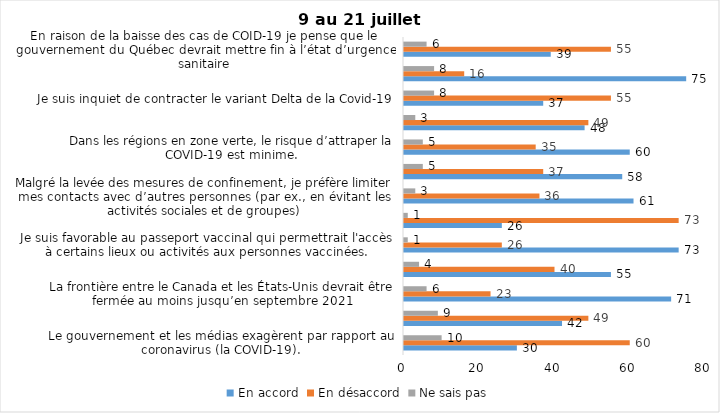
| Category | En accord | En désaccord | Ne sais pas |
|---|---|---|---|
| Le gouvernement et les médias exagèrent par rapport au coronavirus (la COVID-19). | 30 | 60 | 10 |
| J’ai peur que le système de santé soit débordé par les cas de COVID-19 suite au "déconfinement" | 42 | 49 | 9 |
| La frontière entre le Canada et les États-Unis devrait être fermée au moins jusqu’en septembre 2021 | 71 | 23 | 6 |
| Les personnes vaccinées contre la COVID-19 devraient avoir le droit de faire des rassemblements privés et de ne plus porter le masque dans les lieux publics. | 55 | 40 | 4 |
| Je suis favorable au passeport vaccinal qui permettrait l'accès à certains lieux ou activités aux personnes vaccinées. | 73 | 26 | 1 |
| Étant donné la progression de la vaccination et la diminution du nombre de cas de COVID-19, je pense qu’il est moins important de suivre les mesures de prévention. | 26 | 73 | 1 |
| Malgré la levée des mesures de confinement, je préfère limiter mes contacts avec d’autres personnes (par ex., en évitant les activités sociales et de groupes) | 61 | 36 | 3 |
| J’ai peur qu’il y ait une 4e vague de la COVID-19. | 58 | 37 | 5 |
| Dans les régions en zone verte, le risque d’attraper la COVID-19 est minime. | 60 | 35 | 5 |
| Si les cas de COVID-19 augmentent cet automne, je suis favorable à la mise en place de mesures de confinement (ex. fermeture de services non essentiels, interdiction des rassemblements privés) | 48 | 49 | 3 |
| Je suis inquiet de contracter le variant Delta de la Covid-19 | 37 | 55 | 8 |
| Je suis confiant que la vaccination protège efficacement contre les variants de la COVID-19 | 75 | 16 | 8 |
| En raison de la baisse des cas de COID-19 je pense que le gouvernement du Québec devrait mettre fin à l’état d’urgence sanitaire | 39 | 55 | 6 |